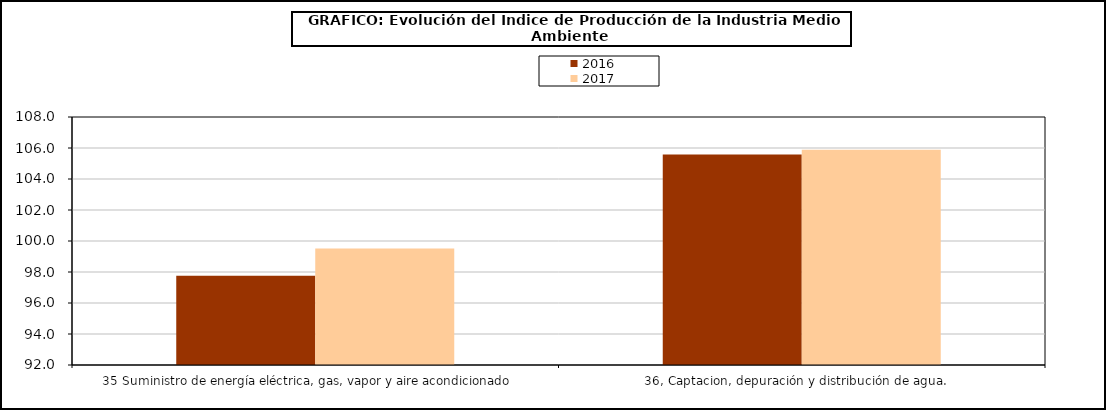
| Category | 2016 | 2017 |
|---|---|---|
| 35 Suministro de energía eléctrica, gas, vapor y aire acondicionado     | 97.756 | 99.521 |
| 36, Captacion, depuración y distribución de agua.    | 105.574 | 105.883 |